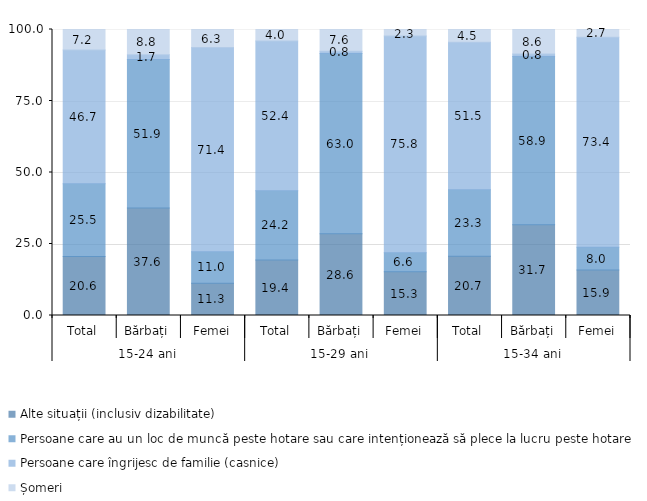
| Category | Alte situații (inclusiv dizabilitate) | Persoane care au un loc de muncă peste hotare sau care intenționează să plece la lucru peste hotare | Persoane care îngrijesc de familie (casnice) | Șomeri |
|---|---|---|---|---|
| 0 | 20.6 | 25.5 | 46.7 | 7.2 |
| 1 | 37.6 | 51.9 | 1.7 | 8.8 |
| 2 | 11.3 | 11 | 71.4 | 6.3 |
| 3 | 19.4 | 24.2 | 52.4 | 4 |
| 4 | 28.6 | 63 | 0.8 | 7.6 |
| 5 | 15.3 | 6.6 | 75.8 | 2.3 |
| 6 | 20.7 | 23.3 | 51.5 | 4.5 |
| 7 | 31.7 | 58.9 | 0.8 | 8.6 |
| 8 | 15.9 | 8 | 73.4 | 2.7 |